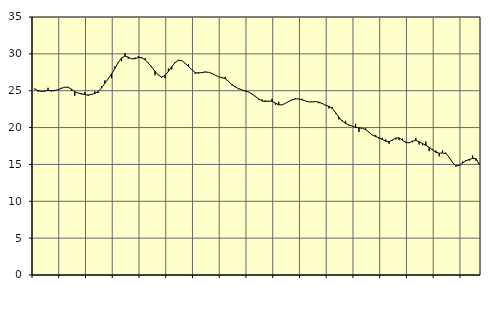
| Category | Piggar | Series 1 |
|---|---|---|
| nan | 25.3 | 25.22 |
| 87.0 | 24.9 | 25.01 |
| 87.0 | 24.9 | 24.89 |
| 87.0 | 25 | 24.95 |
| nan | 25.4 | 25.03 |
| 88.0 | 24.9 | 25.02 |
| 88.0 | 25.1 | 25.02 |
| 88.0 | 25.2 | 25.13 |
| nan | 25.4 | 25.31 |
| 89.0 | 25.5 | 25.48 |
| 89.0 | 25.4 | 25.48 |
| 89.0 | 25 | 25.21 |
| nan | 24.3 | 24.86 |
| 90.0 | 24.7 | 24.68 |
| 90.0 | 24.5 | 24.59 |
| 90.0 | 24.8 | 24.47 |
| nan | 24.3 | 24.42 |
| 91.0 | 24.5 | 24.5 |
| 91.0 | 24.9 | 24.63 |
| 91.0 | 24.7 | 24.87 |
| nan | 25.6 | 25.38 |
| 92.0 | 26.4 | 26.01 |
| 92.0 | 26.7 | 26.6 |
| 92.0 | 26.7 | 27.27 |
| nan | 28.3 | 28.03 |
| 93.0 | 28.9 | 28.83 |
| 93.0 | 29 | 29.45 |
| 93.0 | 30.1 | 29.71 |
| nan | 29.3 | 29.56 |
| 94.0 | 29.3 | 29.32 |
| 94.0 | 29.5 | 29.34 |
| 94.0 | 29.7 | 29.5 |
| nan | 29.4 | 29.49 |
| 95.0 | 29.4 | 29.2 |
| 95.0 | 28.8 | 28.75 |
| 95.0 | 28.3 | 28.2 |
| nan | 27.1 | 27.64 |
| 96.0 | 27.1 | 27.12 |
| 96.0 | 26.8 | 26.86 |
| 96.0 | 26.7 | 27.08 |
| nan | 28 | 27.62 |
| 97.0 | 27.9 | 28.26 |
| 97.0 | 28.9 | 28.81 |
| 97.0 | 29.2 | 29.12 |
| nan | 29.1 | 29.08 |
| 98.0 | 28.7 | 28.74 |
| 98.0 | 28.6 | 28.3 |
| 98.0 | 27.9 | 27.85 |
| nan | 27.3 | 27.47 |
| 99.0 | 27.5 | 27.38 |
| 99.0 | 27.4 | 27.47 |
| 99.0 | 27.6 | 27.53 |
| nan | 27.5 | 27.5 |
| 0.0 | 27.4 | 27.35 |
| 0.0 | 27.1 | 27.11 |
| 0.0 | 26.9 | 26.9 |
| nan | 26.7 | 26.78 |
| 1.0 | 26.9 | 26.62 |
| 1.0 | 26.2 | 26.26 |
| 1.0 | 25.7 | 25.83 |
| nan | 25.6 | 25.5 |
| 2.0 | 25.2 | 25.29 |
| 2.0 | 25.1 | 25.11 |
| 2.0 | 24.9 | 24.97 |
| nan | 24.8 | 24.82 |
| 3.0 | 24.5 | 24.56 |
| 3.0 | 24.3 | 24.23 |
| 3.0 | 23.8 | 23.89 |
| nan | 23.8 | 23.61 |
| 4.0 | 23.7 | 23.54 |
| 4.0 | 23.5 | 23.6 |
| 4.0 | 23.9 | 23.58 |
| nan | 23.1 | 23.33 |
| 5.0 | 23.5 | 23.08 |
| 5.0 | 23.1 | 23.08 |
| 5.0 | 23.3 | 23.29 |
| nan | 23.5 | 23.56 |
| 6.0 | 23.8 | 23.77 |
| 6.0 | 24 | 23.89 |
| 6.0 | 23.9 | 23.89 |
| nan | 23.9 | 23.77 |
| 7.0 | 23.6 | 23.61 |
| 7.0 | 23.5 | 23.48 |
| 7.0 | 23.5 | 23.48 |
| nan | 23.5 | 23.52 |
| 8.0 | 23.3 | 23.46 |
| 8.0 | 23.2 | 23.26 |
| 8.0 | 23 | 23.04 |
| nan | 22.6 | 22.88 |
| 9.0 | 22.8 | 22.6 |
| 9.0 | 21.9 | 22.05 |
| 9.0 | 21.1 | 21.4 |
| nan | 21 | 20.89 |
| 10.0 | 20.9 | 20.56 |
| 10.0 | 20.3 | 20.36 |
| 10.0 | 20.2 | 20.2 |
| nan | 20.5 | 20.03 |
| 11.0 | 19.4 | 19.95 |
| 11.0 | 19.9 | 19.9 |
| 11.0 | 19.9 | 19.72 |
| nan | 19.4 | 19.36 |
| 12.0 | 19 | 18.99 |
| 12.0 | 19 | 18.78 |
| 12.0 | 18.5 | 18.62 |
| nan | 18.6 | 18.38 |
| 13.0 | 18.4 | 18.14 |
| 13.0 | 17.8 | 18.08 |
| 13.0 | 18.2 | 18.3 |
| nan | 18.4 | 18.59 |
| 14.0 | 18.3 | 18.6 |
| 14.0 | 18.5 | 18.29 |
| 14.0 | 18.1 | 17.96 |
| nan | 17.9 | 17.94 |
| 15.0 | 18 | 18.17 |
| 15.0 | 18.6 | 18.26 |
| 15.0 | 17.7 | 18.09 |
| nan | 17.6 | 17.84 |
| 16.0 | 18.1 | 17.59 |
| 16.0 | 16.8 | 17.33 |
| 16.0 | 17.1 | 16.97 |
| nan | 16.9 | 16.64 |
| 17.0 | 16.1 | 16.52 |
| 17.0 | 16.9 | 16.55 |
| 17.0 | 16.6 | 16.48 |
| nan | 16 | 15.96 |
| 18.0 | 15.3 | 15.25 |
| 18.0 | 14.7 | 14.81 |
| 18.0 | 14.8 | 14.85 |
| nan | 15.4 | 15.19 |
| 19.0 | 15.6 | 15.5 |
| 19.0 | 15.5 | 15.69 |
| 19.0 | 16.2 | 15.8 |
| nan | 15.5 | 15.79 |
| 20.0 | 15.1 | 14.98 |